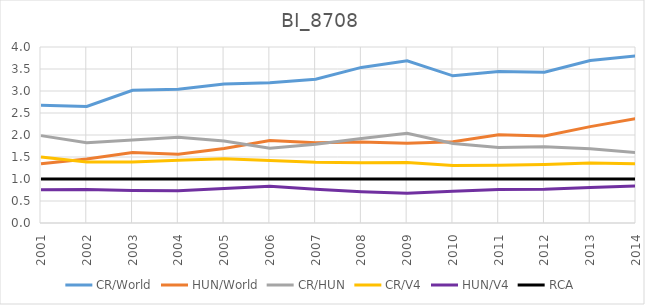
| Category | CR/World | HUN/World | CR/HUN | CR/V4 | HUN/V4 | RCA |
|---|---|---|---|---|---|---|
| 2001.0 | 2.676 | 1.347 | 1.986 | 1.502 | 0.757 | 1 |
| 2002.0 | 2.647 | 1.453 | 1.822 | 1.388 | 0.762 | 1 |
| 2003.0 | 3.016 | 1.6 | 1.884 | 1.388 | 0.736 | 1 |
| 2004.0 | 3.042 | 1.562 | 1.947 | 1.428 | 0.733 | 1 |
| 2005.0 | 3.161 | 1.695 | 1.865 | 1.46 | 0.783 | 1 |
| 2006.0 | 3.189 | 1.876 | 1.7 | 1.419 | 0.835 | 1 |
| 2007.0 | 3.266 | 1.823 | 1.792 | 1.379 | 0.77 | 1 |
| 2008.0 | 3.536 | 1.84 | 1.922 | 1.369 | 0.712 | 1 |
| 2009.0 | 3.687 | 1.81 | 2.037 | 1.374 | 0.674 | 1 |
| 2010.0 | 3.345 | 1.849 | 1.809 | 1.308 | 0.723 | 1 |
| 2011.0 | 3.444 | 2.006 | 1.717 | 1.311 | 0.764 | 1 |
| 2012.0 | 3.425 | 1.976 | 1.733 | 1.332 | 0.768 | 1 |
| 2013.0 | 3.691 | 2.19 | 1.685 | 1.362 | 0.808 | 1 |
| 2014.0 | 3.798 | 2.374 | 1.6 | 1.346 | 0.841 | 1 |